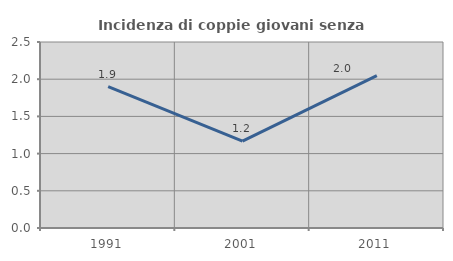
| Category | Incidenza di coppie giovani senza figli |
|---|---|
| 1991.0 | 1.901 |
| 2001.0 | 1.167 |
| 2011.0 | 2.049 |